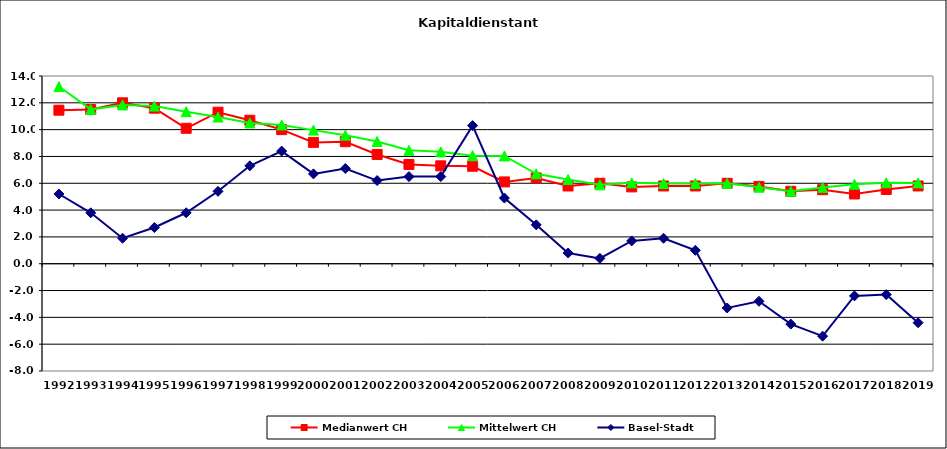
| Category | Medianwert CH | Mittelwert CH | Basel-Stadt |
|---|---|---|---|
| 1992.0 | 11.45 | 13.212 | 5.2 |
| 1993.0 | 11.5 | 11.512 | 3.8 |
| 1994.0 | 12 | 11.842 | 1.9 |
| 1995.0 | 11.6 | 11.756 | 2.7 |
| 1996.0 | 10.1 | 11.342 | 3.8 |
| 1997.0 | 11.3 | 10.938 | 5.4 |
| 1998.0 | 10.7 | 10.5 | 7.3 |
| 1999.0 | 10 | 10.35 | 8.4 |
| 2000.0 | 9.05 | 9.964 | 6.7 |
| 2001.0 | 9.1 | 9.588 | 7.1 |
| 2002.0 | 8.15 | 9.121 | 6.2 |
| 2003.0 | 7.4 | 8.458 | 6.5 |
| 2004.0 | 7.3 | 8.345 | 6.5 |
| 2005.0 | 7.27 | 8.061 | 10.3 |
| 2006.0 | 6.1 | 8.039 | 4.9 |
| 2007.0 | 6.4 | 6.706 | 2.9 |
| 2008.0 | 5.8 | 6.277 | 0.8 |
| 2009.0 | 6 | 5.883 | 0.4 |
| 2010.0 | 5.73 | 6.031 | 1.7 |
| 2011.0 | 5.8 | 5.983 | 1.9 |
| 2012.0 | 5.8 | 5.983 | 1 |
| 2013.0 | 6 | 5.994 | -3.3 |
| 2014.0 | 5.765 | 5.705 | -2.8 |
| 2015.0 | 5.4 | 5.408 | -4.5 |
| 2016.0 | 5.52 | 5.692 | -5.4 |
| 2017.0 | 5.2 | 5.927 | -2.4 |
| 2018.0 | 5.535 | 6.039 | -2.3 |
| 2019.0 | 5.8 | 6.026 | -4.4 |